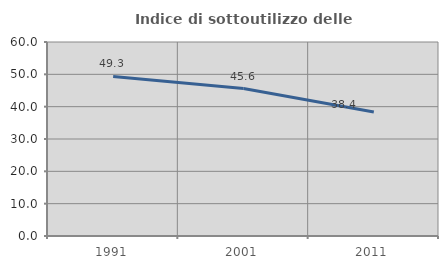
| Category | Indice di sottoutilizzo delle abitazioni  |
|---|---|
| 1991.0 | 49.333 |
| 2001.0 | 45.588 |
| 2011.0 | 38.356 |